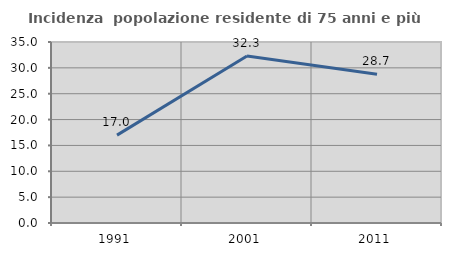
| Category | Incidenza  popolazione residente di 75 anni e più |
|---|---|
| 1991.0 | 16.996 |
| 2001.0 | 32.275 |
| 2011.0 | 28.743 |